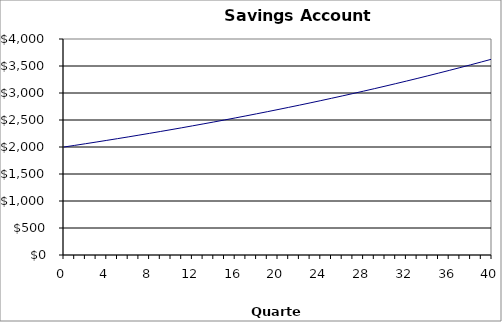
| Category | Series 0 |
|---|---|
| 0.0 | 2000 |
| 1.0 | 2030 |
| 2.0 | 2060.45 |
| 3.0 | 2091.36 |
| 4.0 | 2122.73 |
| 5.0 | 2154.57 |
| 6.0 | 2186.89 |
| 7.0 | 2219.69 |
| 8.0 | 2252.99 |
| 9.0 | 2286.78 |
| 10.0 | 2321.08 |
| 11.0 | 2355.9 |
| 12.0 | 2391.24 |
| 13.0 | 2427.11 |
| 14.0 | 2463.52 |
| 15.0 | 2500.47 |
| 16.0 | 2537.98 |
| 17.0 | 2576.05 |
| 18.0 | 2614.69 |
| 19.0 | 2653.91 |
| 20.0 | 2693.72 |
| 21.0 | 2734.13 |
| 22.0 | 2775.14 |
| 23.0 | 2816.77 |
| 24.0 | 2859.02 |
| 25.0 | 2901.91 |
| 26.0 | 2945.44 |
| 27.0 | 2989.62 |
| 28.0 | 3034.46 |
| 29.0 | 3079.98 |
| 30.0 | 3126.18 |
| 31.0 | 3173.07 |
| 32.0 | 3220.67 |
| 33.0 | 3268.98 |
| 34.0 | 3318.01 |
| 35.0 | 3367.78 |
| 36.0 | 3418.3 |
| 37.0 | 3469.57 |
| 38.0 | 3521.61 |
| 39.0 | 3574.43 |
| 40.0 | 3628.05 |